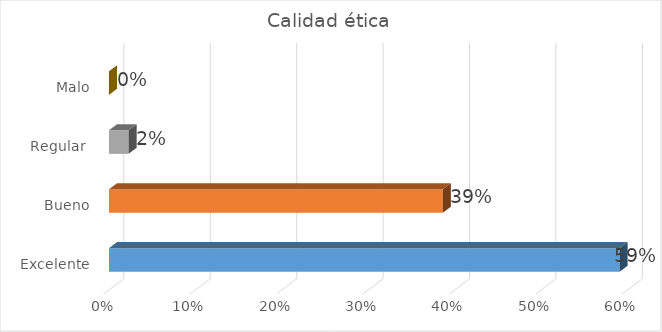
| Category | Series 0 |
|---|---|
| Excelente | 0.591 |
| Bueno | 0.386 |
| Regular  | 0.023 |
| Malo | 0 |